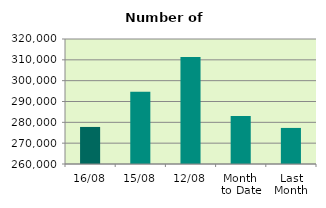
| Category | Series 0 |
|---|---|
| 16/08 | 277786 |
| 15/08 | 294676 |
| 12/08 | 311308 |
| Month 
to Date | 283084.5 |
| Last
Month | 277312.476 |